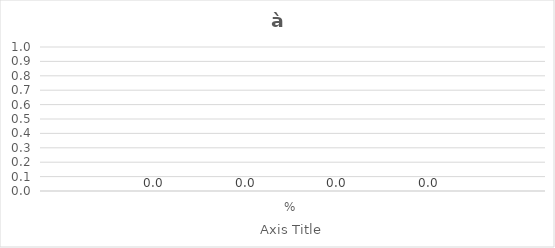
| Category | Series 0 | Series 1 | Series 2 | Series 3 |
|---|---|---|---|---|
| % | 0 | 0 | 0 | 0 |